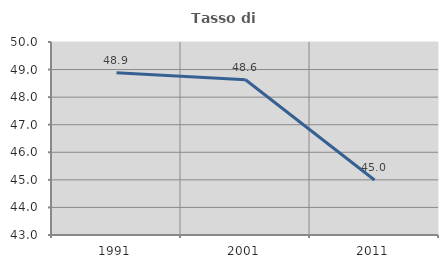
| Category | Tasso di occupazione   |
|---|---|
| 1991.0 | 48.883 |
| 2001.0 | 48.632 |
| 2011.0 | 44.994 |